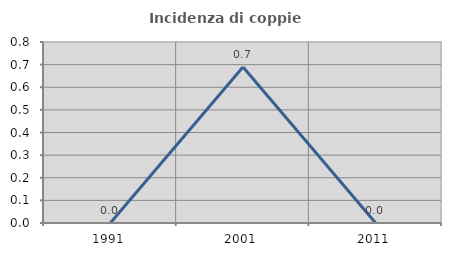
| Category | Incidenza di coppie miste |
|---|---|
| 1991.0 | 0 |
| 2001.0 | 0.69 |
| 2011.0 | 0 |